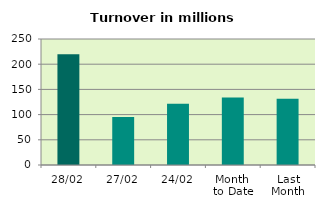
| Category | Series 0 |
|---|---|
| 28/02 | 219.511 |
| 27/02 | 95.349 |
| 24/02 | 121.4 |
| Month 
to Date | 133.846 |
| Last
Month | 131.402 |